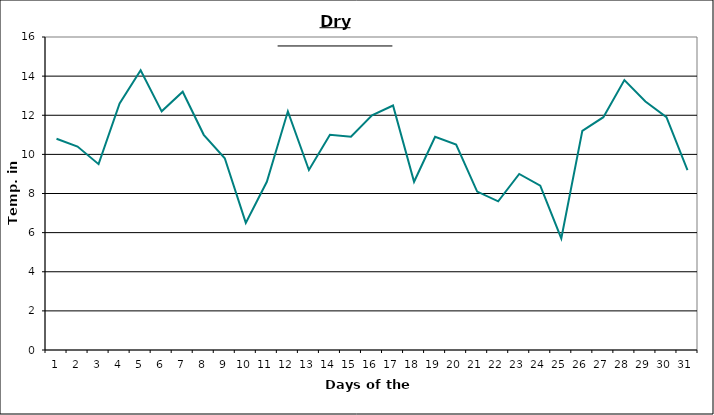
| Category | Series 0 |
|---|---|
| 0 | 10.8 |
| 1 | 10.4 |
| 2 | 9.5 |
| 3 | 12.6 |
| 4 | 14.3 |
| 5 | 12.2 |
| 6 | 13.2 |
| 7 | 11 |
| 8 | 9.8 |
| 9 | 6.5 |
| 10 | 8.6 |
| 11 | 12.2 |
| 12 | 9.2 |
| 13 | 11 |
| 14 | 10.9 |
| 15 | 12 |
| 16 | 12.5 |
| 17 | 8.6 |
| 18 | 10.9 |
| 19 | 10.5 |
| 20 | 8.1 |
| 21 | 7.6 |
| 22 | 9 |
| 23 | 8.4 |
| 24 | 5.7 |
| 25 | 11.2 |
| 26 | 11.9 |
| 27 | 13.8 |
| 28 | 12.7 |
| 29 | 11.9 |
| 30 | 9.2 |